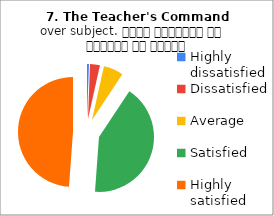
| Category | 7. The Teacher's Command over subject. विषय अवधारणा पर शिक्षक का ज्ञान |
|---|---|
| Highly dissatisfied | 1 |
| Dissatisfied | 5 |
| Average | 10 |
| Satisfied | 72 |
| Highly satisfied | 84 |